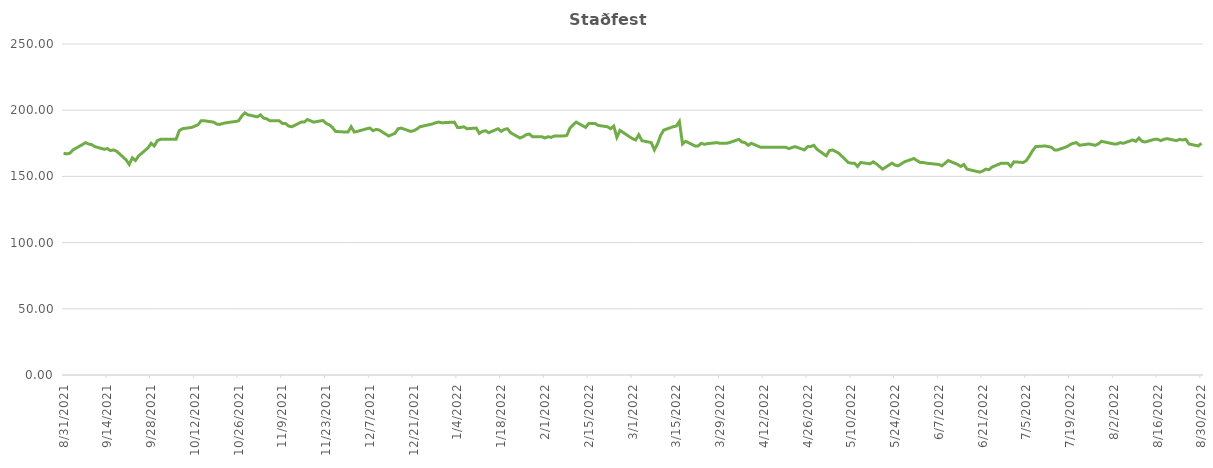
| Category | Staðfest dagslokaverð |
|---|---|
| 8/31/21 | 167.5 |
| 9/1/21 | 167 |
| 9/2/21 | 167.5 |
| 9/3/21 | 170 |
| 9/6/21 | 174 |
| 9/7/21 | 175.5 |
| 9/8/21 | 174.5 |
| 9/9/21 | 174 |
| 9/10/21 | 172.5 |
| 9/13/21 | 170.5 |
| 9/14/21 | 171 |
| 9/15/21 | 169.5 |
| 9/16/21 | 170 |
| 9/17/21 | 169 |
| 9/20/21 | 162.5 |
| 9/21/21 | 159 |
| 9/22/21 | 164 |
| 9/23/21 | 162 |
| 9/24/21 | 165.5 |
| 9/27/21 | 171.5 |
| 9/28/21 | 175 |
| 9/29/21 | 173 |
| 9/30/21 | 177 |
| 10/1/21 | 178 |
| 10/4/21 | 178 |
| 10/5/21 | 178 |
| 10/6/21 | 178 |
| 10/7/21 | 184.5 |
| 10/8/21 | 186 |
| 10/11/21 | 187 |
| 10/12/21 | 188 |
| 10/13/21 | 189 |
| 10/14/21 | 192 |
| 10/15/21 | 192 |
| 10/18/21 | 191 |
| 10/19/21 | 189.5 |
| 10/20/21 | 189.25 |
| 10/21/21 | 190 |
| 10/22/21 | 190.5 |
| 10/25/21 | 191.5 |
| 10/26/21 | 192 |
| 10/27/21 | 195.5 |
| 10/28/21 | 198 |
| 10/29/21 | 196.5 |
| 11/1/21 | 195 |
| 11/2/21 | 196.5 |
| 11/3/21 | 194 |
| 11/4/21 | 193.5 |
| 11/5/21 | 192 |
| 11/8/21 | 192 |
| 11/9/21 | 190 |
| 11/10/21 | 190 |
| 11/11/21 | 188 |
| 11/12/21 | 187.5 |
| 11/15/21 | 191 |
| 11/16/21 | 191 |
| 11/17/21 | 193 |
| 11/18/21 | 192 |
| 11/19/21 | 191 |
| 11/22/21 | 192.25 |
| 11/23/21 | 190 |
| 11/24/21 | 189 |
| 11/25/21 | 187 |
| 11/26/21 | 184 |
| 11/29/21 | 183.5 |
| 11/30/21 | 183.5 |
| 12/1/21 | 187.5 |
| 12/2/21 | 183.5 |
| 12/3/21 | 184 |
| 12/6/21 | 186 |
| 12/7/21 | 186.5 |
| 12/8/21 | 184.5 |
| 12/9/21 | 185.5 |
| 12/10/21 | 185 |
| 12/13/21 | 180.5 |
| 12/14/21 | 181.5 |
| 12/15/21 | 182.5 |
| 12/16/21 | 186 |
| 12/17/21 | 186.5 |
| 12/20/21 | 184 |
| 12/21/21 | 184.5 |
| 12/22/21 | 185.75 |
| 12/23/21 | 187.5 |
| 12/27/21 | 189.6 |
| 12/28/21 | 190.5 |
| 12/29/21 | 191 |
| 12/30/21 | 190.5 |
| 1/3/22 | 191 |
| 1/4/22 | 187 |
| 1/5/22 | 187 |
| 1/6/22 | 187.5 |
| 1/7/22 | 186 |
| 1/10/22 | 186.5 |
| 1/11/22 | 182.5 |
| 1/12/22 | 184 |
| 1/13/22 | 184.5 |
| 1/14/22 | 183 |
| 1/17/22 | 186 |
| 1/18/22 | 184 |
| 1/19/22 | 185.5 |
| 1/20/22 | 186 |
| 1/21/22 | 183 |
| 1/24/22 | 179 |
| 1/25/22 | 180 |
| 1/26/22 | 181.5 |
| 1/27/22 | 182 |
| 1/28/22 | 180 |
| 1/31/22 | 180 |
| 2/1/22 | 179 |
| 2/2/22 | 180 |
| 2/3/22 | 179.5 |
| 2/4/22 | 180.5 |
| 2/7/22 | 180.5 |
| 2/8/22 | 181 |
| 2/9/22 | 186.5 |
| 2/10/22 | 189 |
| 2/11/22 | 191 |
| 2/14/22 | 187 |
| 2/15/22 | 190 |
| 2/16/22 | 190 |
| 2/17/22 | 190 |
| 2/18/22 | 188.5 |
| 2/21/22 | 187.5 |
| 2/22/22 | 186 |
| 2/23/22 | 188 |
| 2/24/22 | 179.5 |
| 2/25/22 | 184.75 |
| 2/28/22 | 180 |
| 3/1/22 | 178.5 |
| 3/2/22 | 177.5 |
| 3/3/22 | 181.5 |
| 3/4/22 | 177 |
| 3/7/22 | 175.5 |
| 3/8/22 | 170 |
| 3/9/22 | 174.5 |
| 3/10/22 | 181 |
| 3/11/22 | 185 |
| 3/14/22 | 187.5 |
| 3/15/22 | 188 |
| 3/16/22 | 191.5 |
| 3/17/22 | 174.5 |
| 3/18/22 | 176.5 |
| 3/21/22 | 173 |
| 3/22/22 | 173 |
| 3/23/22 | 175 |
| 3/24/22 | 174.25 |
| 3/25/22 | 174.75 |
| 3/28/22 | 175.5 |
| 3/29/22 | 175 |
| 3/30/22 | 175 |
| 3/31/22 | 175 |
| 4/1/22 | 175.5 |
| 4/4/22 | 178 |
| 4/5/22 | 176 |
| 4/6/22 | 175.5 |
| 4/7/22 | 173.5 |
| 4/8/22 | 175 |
| 4/11/22 | 172 |
| 4/12/22 | 172 |
| 4/13/22 | 172 |
| 4/19/22 | 172 |
| 4/20/22 | 171 |
| 4/22/22 | 172.5 |
| 4/25/22 | 170 |
| 4/26/22 | 172.5 |
| 4/27/22 | 172.5 |
| 4/28/22 | 173.5 |
| 4/29/22 | 170.5 |
| 5/2/22 | 165.5 |
| 5/3/22 | 169.5 |
| 5/4/22 | 170 |
| 5/5/22 | 168.75 |
| 5/6/22 | 167.5 |
| 5/9/22 | 160.5 |
| 5/10/22 | 160 |
| 5/11/22 | 160 |
| 5/12/22 | 157.5 |
| 5/13/22 | 160.5 |
| 5/16/22 | 159.5 |
| 5/17/22 | 161 |
| 5/18/22 | 159.5 |
| 5/19/22 | 157.5 |
| 5/20/22 | 155.5 |
| 5/23/22 | 160 |
| 5/24/22 | 158.5 |
| 5/25/22 | 158 |
| 5/27/22 | 161 |
| 5/30/22 | 163.5 |
| 5/31/22 | 162 |
| 6/1/22 | 160.5 |
| 6/2/22 | 160.5 |
| 6/3/22 | 160 |
| 6/7/22 | 159 |
| 6/8/22 | 158 |
| 6/9/22 | 160 |
| 6/10/22 | 162 |
| 6/13/22 | 159 |
| 6/14/22 | 157.5 |
| 6/15/22 | 159 |
| 6/16/22 | 155.5 |
| 6/20/22 | 153.25 |
| 6/21/22 | 154 |
| 6/22/22 | 155.5 |
| 6/23/22 | 155 |
| 6/24/22 | 157 |
| 6/27/22 | 160 |
| 6/28/22 | 160 |
| 6/29/22 | 160 |
| 6/30/22 | 157.5 |
| 7/1/22 | 161 |
| 7/4/22 | 160.5 |
| 7/5/22 | 162 |
| 7/6/22 | 165.5 |
| 7/7/22 | 169.5 |
| 7/8/22 | 172.5 |
| 7/11/22 | 173 |
| 7/12/22 | 172.5 |
| 7/13/22 | 172 |
| 7/14/22 | 170 |
| 7/15/22 | 170 |
| 7/18/22 | 172.5 |
| 7/19/22 | 174 |
| 7/20/22 | 175 |
| 7/21/22 | 175.5 |
| 7/22/22 | 173.5 |
| 7/25/22 | 174.5 |
| 7/26/22 | 174 |
| 7/27/22 | 173.5 |
| 7/28/22 | 174.5 |
| 7/29/22 | 176.5 |
| 8/2/22 | 174.5 |
| 8/3/22 | 174.5 |
| 8/4/22 | 175.5 |
| 8/5/22 | 175 |
| 8/8/22 | 177.5 |
| 8/9/22 | 176.5 |
| 8/10/22 | 179 |
| 8/11/22 | 176.5 |
| 8/12/22 | 176 |
| 8/15/22 | 178 |
| 8/16/22 | 178 |
| 8/17/22 | 177 |
| 8/18/22 | 178 |
| 8/19/22 | 178.5 |
| 8/22/22 | 177 |
| 8/23/22 | 178 |
| 8/24/22 | 177.5 |
| 8/25/22 | 178 |
| 8/26/22 | 174.5 |
| 8/29/22 | 173 |
| 8/30/22 | 175 |